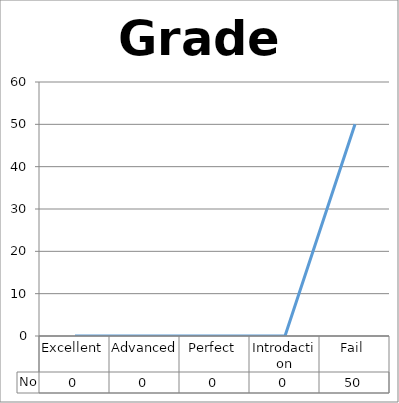
| Category | No |
|---|---|
| Excellent | 0 |
| Advanced | 0 |
| Perfect | 0 |
| Introdaction | 0 |
| Fail | 50 |